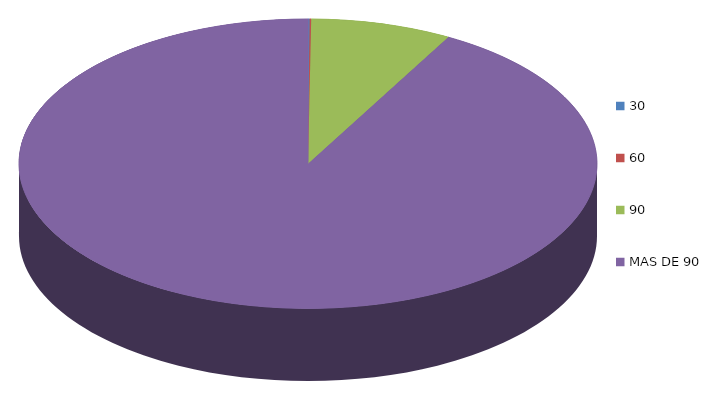
| Category | Series 0 | 59,713.9 |
|---|---|---|
| 0 | 59713.9 |  |
| 1 | 61422.8 |  |
| 2 | 5406692.4 |  |
| 3 | 63052276.5 |  |